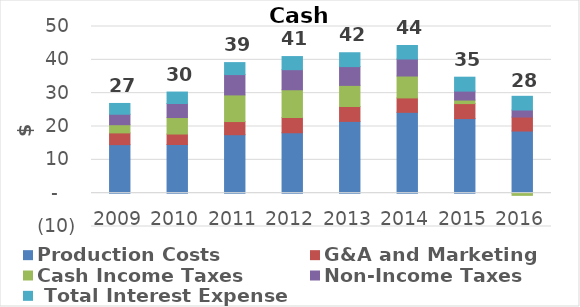
| Category | Production Costs  | G&A and Marketing  | Cash Income Taxes  | Non-Income Taxes  |  Total Interest Expense  |
|---|---|---|---|---|---|
| 2009 | 14556.562 | 3526.468 | 2456.281 | 3140.04 | 3235.359 |
| 2010 | 14595.117 | 3147.665 | 4943.287 | 4216.728 | 3434.31 |
| 2011 | 17532.968 | 3947.38 | 7993.717 | 6106.777 | 3589.567 |
| 2012 | 18118.445 | 4575.133 | 8326.793 | 6026.475 | 3933.588 |
| 2013 | 21533.945 | 4461.489 | 6337.338 | 5637.319 | 4158.012 |
| 2014 | 24246.827 | 4326.506 | 6569.414 | 5111.927 | 4045.18 |
| 2015 | 22374.38 | 4500.978 | 1058.671 | 2681.641 | 4177.918 |
| 2016 | 18639.13 | 4202.902 | -655.85 | 2103.042 | 4111.169 |